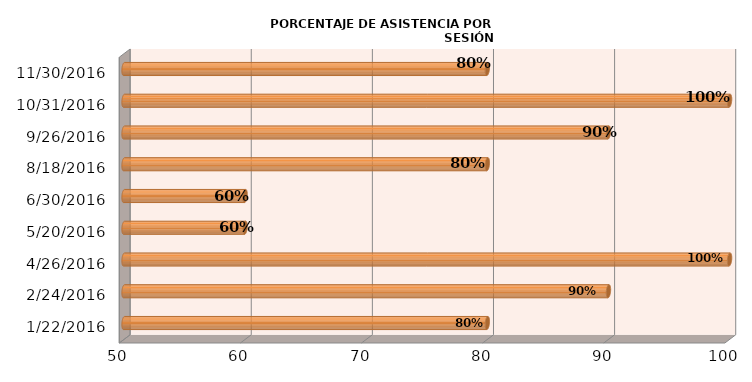
| Category | 80 |
|---|---|
| 1/22/16 | 80 |
| 2/24/16 | 90 |
| 4/26/16 | 100 |
| 5/20/16 | 60 |
| 6/30/16 | 60 |
| 8/18/16 | 80 |
| 9/26/16 | 90 |
| 10/31/16 | 100 |
| 11/30/16 | 80 |